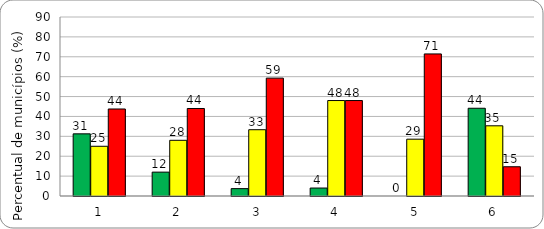
| Category | Series 0 | Series 1 | Series 2 |
|---|---|---|---|
| 0 | 31.25 | 25 | 43.75 |
| 1 | 12 | 28 | 44 |
| 2 | 3.704 | 33.333 | 59.259 |
| 3 | 4 | 48 | 48 |
| 4 | 0 | 28.571 | 71.429 |
| 5 | 44.118 | 35.294 | 14.706 |